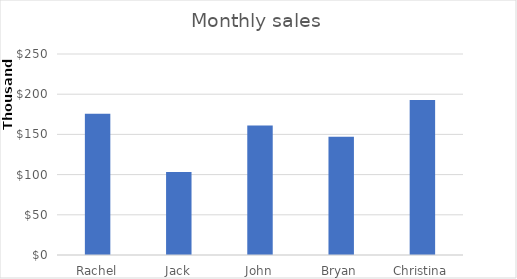
| Category | Monthly sales |
|---|---|
| Rachel | 175637 |
| Jack | 103318 |
| John | 161214 |
| Bryan | 147060 |
| Christina | 192666 |